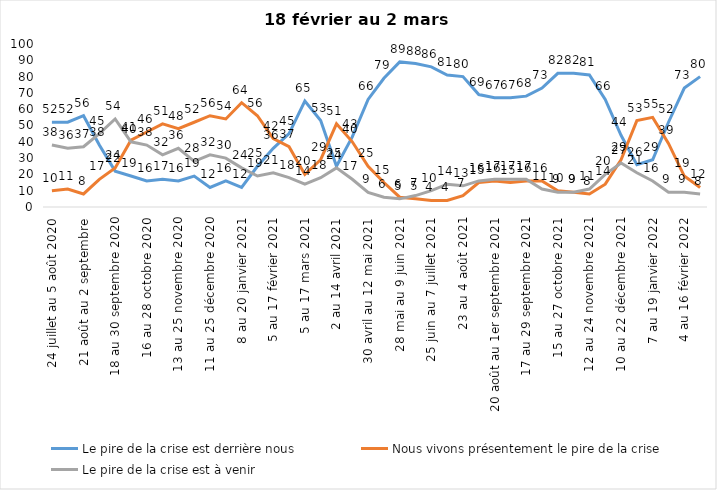
| Category | Le pire de la crise est derrière nous | Nous vivons présentement le pire de la crise | Le pire de la crise est à venir |
|---|---|---|---|
| 24 juillet au 5 août 2020 | 52 | 10 | 38 |
| 7 au 19 août 2020 | 52 | 11 | 36 |
| 21 août au 2 septembre | 56 | 8 | 37 |
| 4 au 16 septembre 2020 | 38 | 17 | 45 |
| 18 au 30 septembre 2020 | 22 | 24 | 54 |
| 2 au 14 octobre 2020 | 19 | 41 | 40 |
| 16 au 28 octobre 2020 | 16 | 46 | 38 |
| 30 octobre au 11 novembre 2020 | 17 | 51 | 32 |
| 13 au 25 novembre 2020 | 16 | 48 | 36 |
| 27 au 9 décembre 2020 | 19 | 52 | 28 |
| 11 au 25 décembre 2020 | 12 | 56 | 32 |
| 25 décembre 2020 au 6 janvier 2021 | 16 | 54 | 30 |
| 8 au 20 janvier 2021 | 12 | 64 | 24 |
| 22 janvier au 3 février 2021 | 25 | 56 | 19 |
| 5 au 17 février 2021 | 36 | 42 | 21 |
| 19 février au 3 mars 2021 | 45 | 37 | 18 |
| 5 au 17 mars 2021 | 65 | 20 | 14 |
| 19 au 31 mars 2021 | 53 | 29 | 18 |
| 2 au 14 avril 2021 | 25 | 51 | 24 |
| 16 au 28 avril 2021 | 43 | 40 | 17 |
| 30 avril au 12 mai 2021 | 66 | 25 | 9 |
| 14 au 26 mai 2021 | 79 | 15 | 6 |
| 28 mai au 9 juin 2021 | 89 | 6 | 5 |
| 11 au 23 juin 2021 | 88 | 5 | 7 |
| 25 juin au 7 juillet 2021 | 86 | 4 | 10 |
| 9 au 21 juillet 2021 | 81 | 4 | 14 |
| 23 au 4 août 2021 | 80 | 7 | 13 |
| 6 au 18 août 2021 | 69 | 15 | 16 |
| 20 août au 1er septembre 2021 | 67 | 16 | 17 |
| 3 au 15 septembre 2021 | 67 | 15 | 17 |
| 17 au 29 septembre 2021 | 68 | 16 | 17 |
| 1 au 13 octobre 2021 | 73 | 16 | 11 |
| 15 au 27 octobre 2021 | 82 | 10 | 9 |
| 29 octobre au 10 novembre 2021 | 82 | 9 | 9 |
| 12 au 24 novembre 2021 | 81 | 8 | 11 |
| 26 novembre au 8 décembre 2021 | 66 | 14 | 20 |
| 10 au 22 décembre 2021 | 44 | 29 | 27 |
| 24 décembre 2021 au 5 janvier 2022 | 26 | 53 | 21 |
| 7 au 19 janvier 2022 | 29 | 55 | 16 |
| 21 janvier au 2 février 2022 | 52 | 39 | 9 |
| 4 au 16 février 2022 | 73 | 19 | 9 |
| 18 février au 2 mars  2022 | 80 | 12 | 8 |